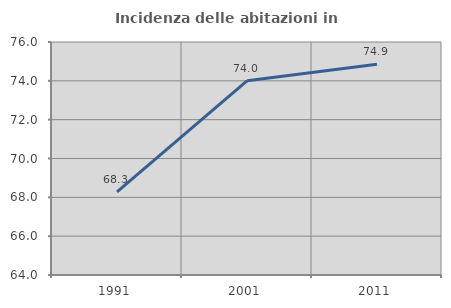
| Category | Incidenza delle abitazioni in proprietà  |
|---|---|
| 1991.0 | 68.282 |
| 2001.0 | 74.003 |
| 2011.0 | 74.86 |